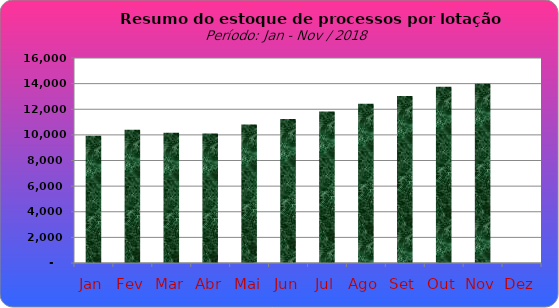
| Category | Series 0 |
|---|---|
| Jan | 9933 |
| Fev | 10393 |
| Mar | 10166 |
| Abr | 10112 |
| Mai | 10819 |
| Jun | 11230 |
| Jul | 11829 |
| Ago | 12430 |
| Set | 13030 |
| Out | 13758 |
| Nov | 13989 |
| Dez | 0 |